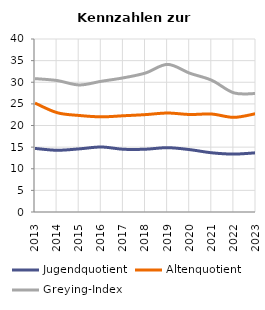
| Category | Jugendquotient | Altenquotient | Greying-Index |
|---|---|---|---|
| 2013.0 | 14.7 | 25.184 | 30.837 |
| 2014.0 | 14.272 | 22.961 | 30.396 |
| 2015.0 | 14.595 | 22.316 | 29.374 |
| 2016.0 | 15.029 | 22.001 | 30.223 |
| 2017.0 | 14.505 | 22.252 | 31.02 |
| 2018.0 | 14.517 | 22.517 | 32.136 |
| 2019.0 | 14.874 | 22.883 | 34.132 |
| 2020.0 | 14.42 | 22.54 | 32.09 |
| 2021.0 | 13.688 | 22.647 | 30.451 |
| 2022.0 | 13.39 | 21.88 | 27.54 |
| 2023.0 | 13.693 | 22.748 | 27.4 |